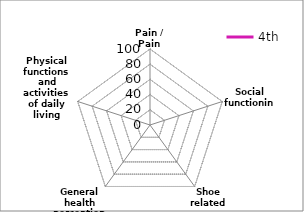
| Category | 4th |
|---|---|
| Pain / Pain related | 0 |
| Social functioning | 0 |
| Shoe related | 0 |
| General health perceptions | 0 |
| Physical functions and activities of daily living (ADL) | 0 |